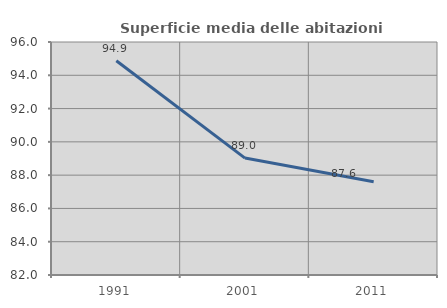
| Category | Superficie media delle abitazioni occupate |
|---|---|
| 1991.0 | 94.877 |
| 2001.0 | 89.025 |
| 2011.0 | 87.604 |